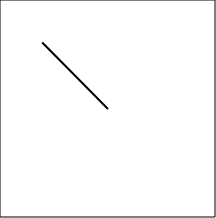
| Category | Series 0 |
|---|---|
| -7.071106771981701 | 7.071 |
| 0.0 | 0 |